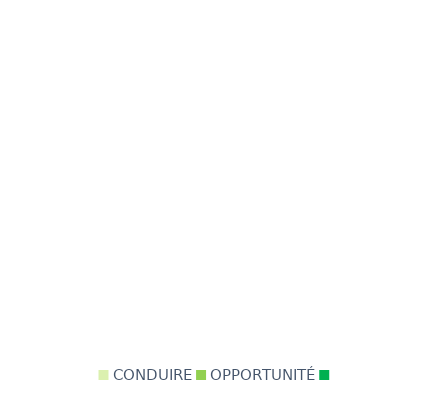
| Category | Series 0 |
|---|---|
| CONDUIRE | 0 |
| OPPORTUNITÉ | 0 |